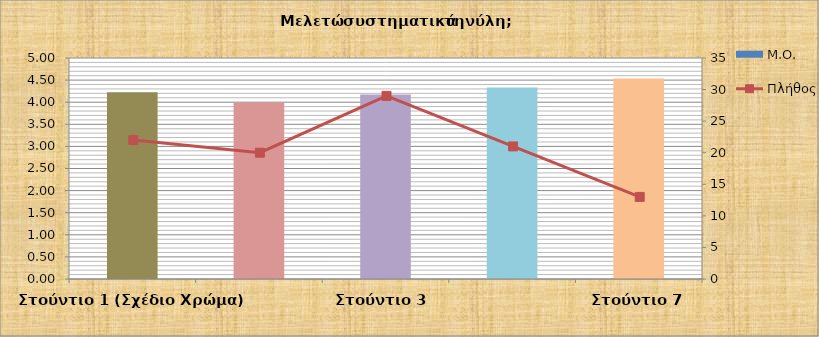
| Category | Μ.Ο. |
|---|---|
| Στούντιο 1 (Σχέδιο Χρώμα) | 4.227 |
| Εργαστήρια Ελεύθερου Σχεδίου 1 | 4 |
| Στούντιο 3  | 4.172 |
| Στούντιο 5 | 4.333 |
| Στούντιο 7 | 4.538 |